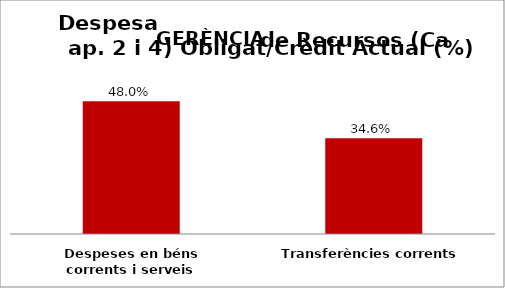
| Category | Series 0 |
|---|---|
| Despeses en béns corrents i serveis | 0.48 |
| Transferències corrents | 0.346 |